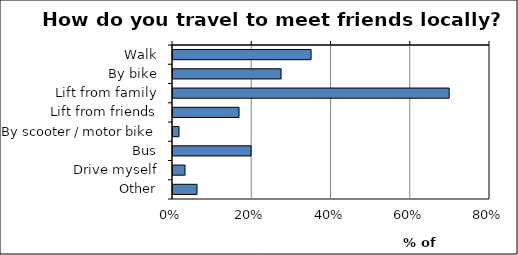
| Category | Series 0 |
|---|---|
| Walk | 0.348 |
| By bike | 0.273 |
| Lift from family | 0.697 |
| Lift from friends | 0.167 |
| By scooter / motor bike | 0.015 |
| Bus | 0.197 |
| Drive myself | 0.03 |
| Other | 0.061 |